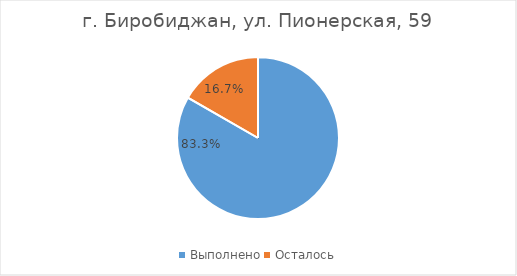
| Category | г. Биробиджан, ул. Пионерская, 59 |
|---|---|
| Выполнено | 0.833 |
| Осталось | 0.167 |